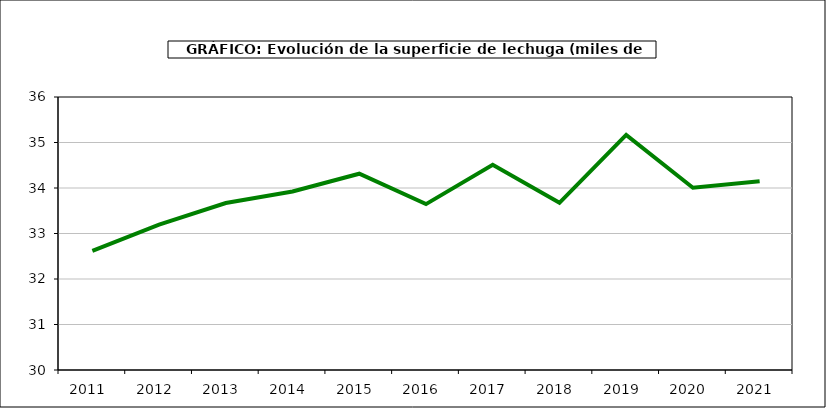
| Category | superficie |
|---|---|
| 2011.0 | 32.62 |
| 2012.0 | 33.196 |
| 2013.0 | 33.669 |
| 2014.0 | 33.924 |
| 2015.0 | 34.314 |
| 2016.0 | 33.646 |
| 2017.0 | 34.508 |
| 2018.0 | 33.674 |
| 2019.0 | 35.168 |
| 2020.0 | 34.005 |
| 2021.0 | 34.15 |